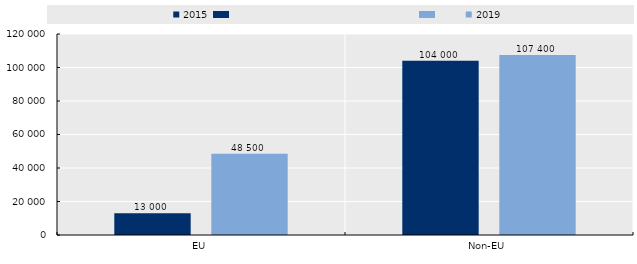
| Category | 2015 | 2019 |
|---|---|---|
| EU | 13000 | 48500 |
| Non-EU | 104000 | 107400 |